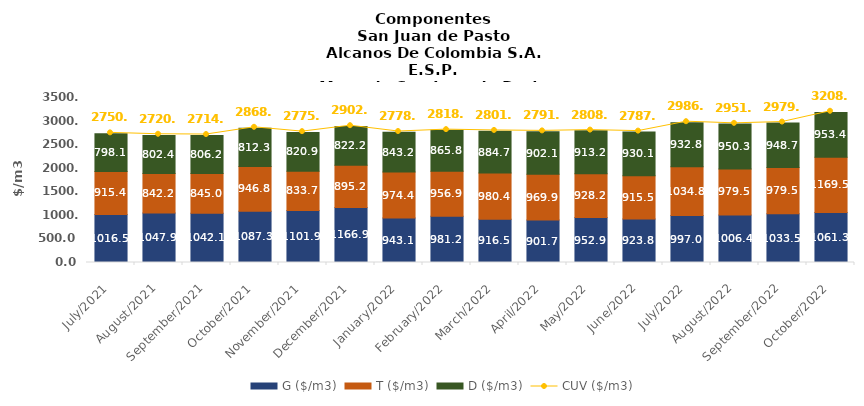
| Category | G ($/m3) | T ($/m3) | D ($/m3) |
|---|---|---|---|
| 2021-07-01 | 1016.54 | 915.44 | 798.11 |
| 2021-08-01 | 1047.91 | 842.22 | 802.39 |
| 2021-09-01 | 1042.08 | 844.95 | 806.22 |
| 2021-10-01 | 1087.34 | 946.76 | 812.32 |
| 2021-11-01 | 1101.92 | 833.69 | 820.85 |
| 2021-12-01 | 1166.9 | 895.22 | 822.17 |
| 2022-01-01 | 943.11 | 974.42 | 843.23 |
| 2022-02-01 | 981.24 | 956.88 | 865.81 |
| 2022-03-01 | 916.5 | 980.4 | 884.73 |
| 2022-04-01 | 901.73 | 969.87 | 902.09 |
| 2022-05-01 | 952.91 | 928.23 | 913.22 |
| 2022-06-01 | 923.8 | 915.47 | 930.11 |
| 2022-07-01 | 996.95 | 1034.77 | 932.75 |
| 2022-08-01 | 1006.44 | 979.53 | 950.32 |
| 2022-09-01 | 1033.47 | 979.51 | 948.67 |
| 2022-10-01 | 1061.27 | 1169.53 | 953.42 |